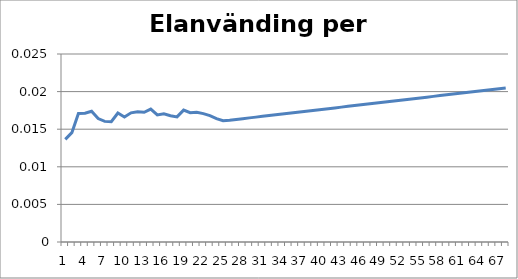
| Category | Elanvänding per person |
|---|---|
| 0 | 0.014 |
| 1 | 0.015 |
| 2 | 0.017 |
| 3 | 0.017 |
| 4 | 0.017 |
| 5 | 0.016 |
| 6 | 0.016 |
| 7 | 0.016 |
| 8 | 0.017 |
| 9 | 0.017 |
| 10 | 0.017 |
| 11 | 0.017 |
| 12 | 0.017 |
| 13 | 0.018 |
| 14 | 0.017 |
| 15 | 0.017 |
| 16 | 0.017 |
| 17 | 0.017 |
| 18 | 0.018 |
| 19 | 0.017 |
| 20 | 0.017 |
| 21 | 0.017 |
| 22 | 0.017 |
| 23 | 0.016 |
| 24 | 0.016 |
| 25 | 0.016 |
| 26 | 0.016 |
| 27 | 0.016 |
| 28 | 0.017 |
| 29 | 0.017 |
| 30 | 0.017 |
| 31 | 0.017 |
| 32 | 0.017 |
| 33 | 0.017 |
| 34 | 0.017 |
| 35 | 0.017 |
| 36 | 0.017 |
| 37 | 0.017 |
| 38 | 0.018 |
| 39 | 0.018 |
| 40 | 0.018 |
| 41 | 0.018 |
| 42 | 0.018 |
| 43 | 0.018 |
| 44 | 0.018 |
| 45 | 0.018 |
| 46 | 0.018 |
| 47 | 0.018 |
| 48 | 0.019 |
| 49 | 0.019 |
| 50 | 0.019 |
| 51 | 0.019 |
| 52 | 0.019 |
| 53 | 0.019 |
| 54 | 0.019 |
| 55 | 0.019 |
| 56 | 0.019 |
| 57 | 0.019 |
| 58 | 0.02 |
| 59 | 0.02 |
| 60 | 0.02 |
| 61 | 0.02 |
| 62 | 0.02 |
| 63 | 0.02 |
| 64 | 0.02 |
| 65 | 0.02 |
| 66 | 0.02 |
| 67 | 0.02 |